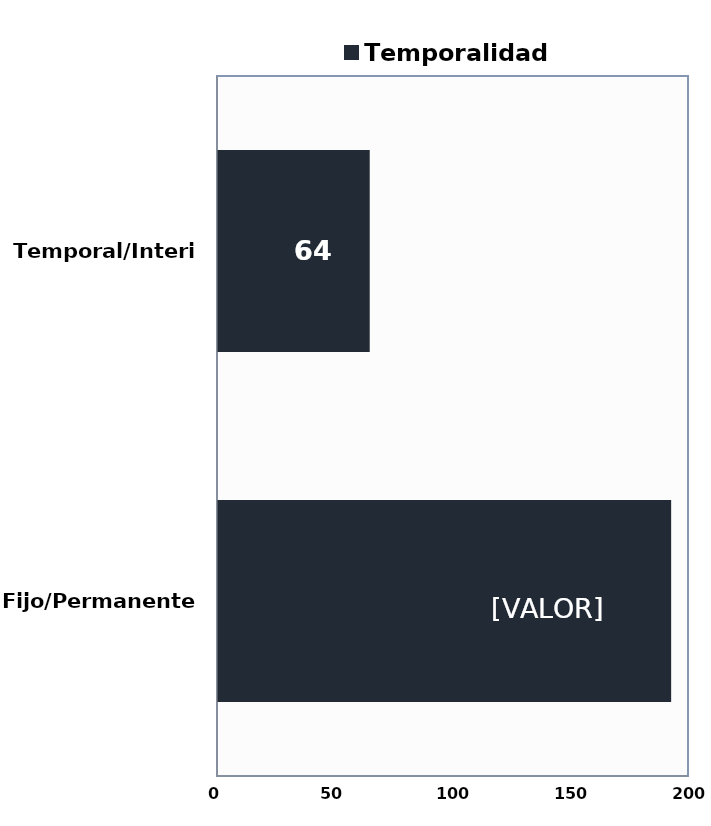
| Category | Temporalidad |
|---|---|
| Fijo/Permanente | 192 |
| Temporal/Interino | 64 |